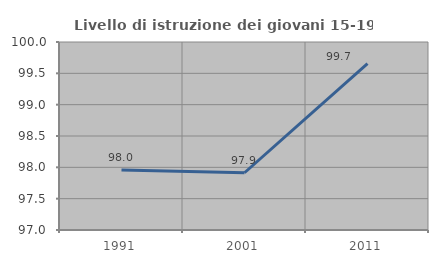
| Category | Livello di istruzione dei giovani 15-19 anni |
|---|---|
| 1991.0 | 97.956 |
| 2001.0 | 97.914 |
| 2011.0 | 99.656 |